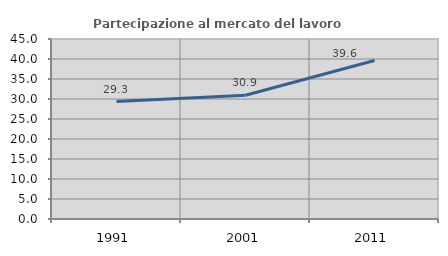
| Category | Partecipazione al mercato del lavoro  femminile |
|---|---|
| 1991.0 | 29.348 |
| 2001.0 | 30.935 |
| 2011.0 | 39.63 |